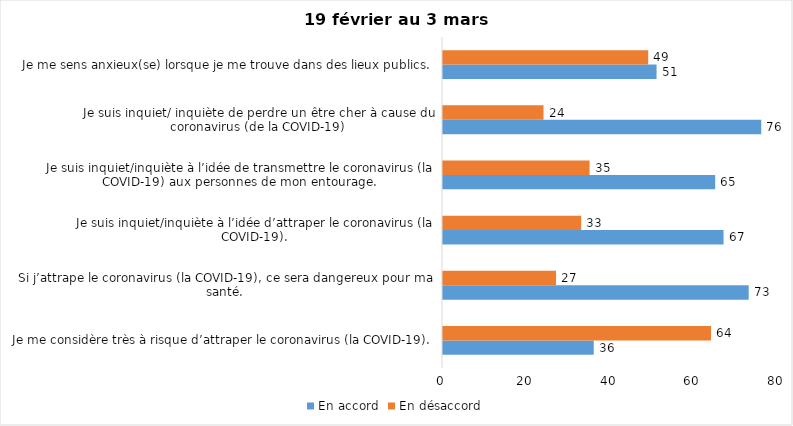
| Category | En accord | En désaccord |
|---|---|---|
| Je me considère très à risque d’attraper le coronavirus (la COVID-19). | 36 | 64 |
| Si j’attrape le coronavirus (la COVID-19), ce sera dangereux pour ma santé. | 73 | 27 |
| Je suis inquiet/inquiète à l’idée d’attraper le coronavirus (la COVID-19). | 67 | 33 |
| Je suis inquiet/inquiète à l’idée de transmettre le coronavirus (la COVID-19) aux personnes de mon entourage. | 65 | 35 |
| Je suis inquiet/ inquiète de perdre un être cher à cause du coronavirus (de la COVID-19) | 76 | 24 |
| Je me sens anxieux(se) lorsque je me trouve dans des lieux publics. | 51 | 49 |